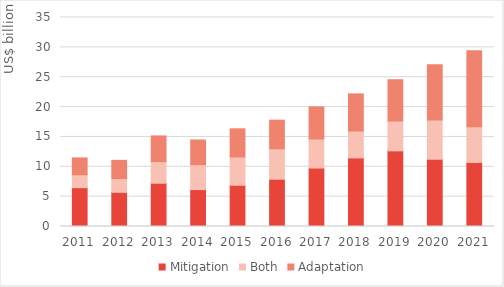
| Category | Mitigation | Both | Adaptation |
|---|---|---|---|
| 2011.0 | 6.503 | 2.164 | 2.82 |
| 2012.0 | 5.72 | 2.3 | 3.059 |
| 2013.0 | 7.249 | 3.625 | 4.296 |
| 2014.0 | 6.18 | 4.183 | 4.131 |
| 2015.0 | 6.903 | 4.743 | 4.715 |
| 2016.0 | 7.921 | 5.092 | 4.791 |
| 2017.0 | 9.79 | 4.873 | 5.374 |
| 2018.0 | 11.488 | 4.491 | 6.225 |
| 2019.0 | 12.669 | 4.997 | 6.918 |
| 2020.0 | 11.264 | 6.569 | 9.239 |
| 2021.0 | 10.726 | 5.972 | 12.718 |